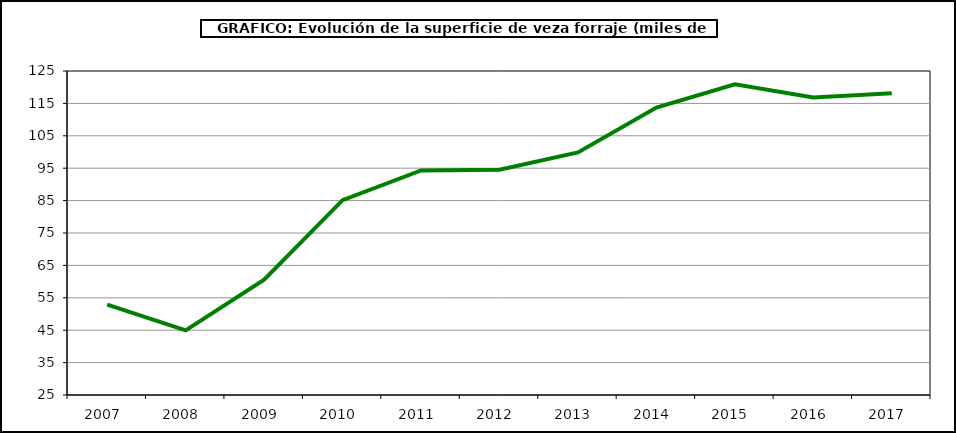
| Category | Superficie |
|---|---|
| 2007.0 | 52.887 |
| 2008.0 | 44.94 |
| 2009.0 | 60.618 |
| 2010.0 | 85.154 |
| 2011.0 | 94.325 |
| 2012.0 | 94.499 |
| 2013.0 | 99.877 |
| 2014.0 | 113.725 |
| 2015.0 | 120.903 |
| 2016.0 | 116.796 |
| 2017.0 | 118.119 |